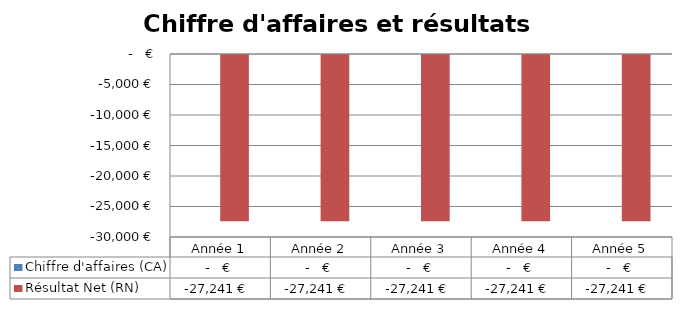
| Category | Chiffre d'affaires (CA) | Résultat Net (RN) |
|---|---|---|
| Année 1 | 0 | -27240.89 |
| Année 2 | 0 | -27240.89 |
| Année 3 | 0 | -27240.89 |
| Année 4 | 0 | -27240.89 |
| Année 5 | 0 | -27240.89 |